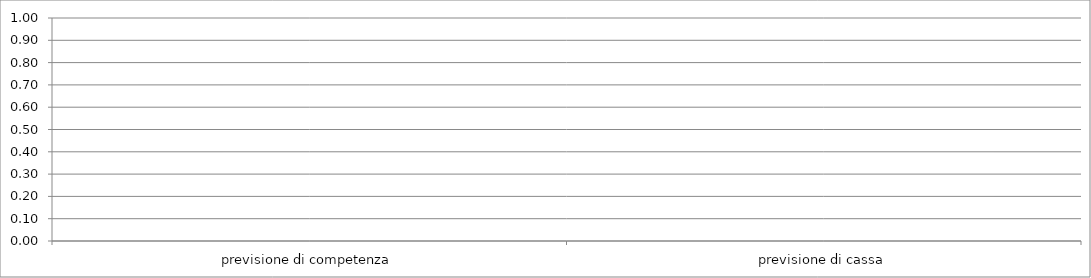
| Category | Series 0 |
|---|---|
| previsione di competenza | 0 |
| previsione di cassa | 0 |